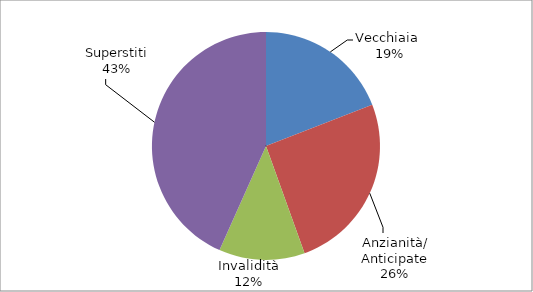
| Category | Series 0 |
|---|---|
| Vecchiaia  | 5573 |
| Anzianità/ Anticipate | 7422 |
| Invalidità | 3554 |
| Superstiti | 12646 |